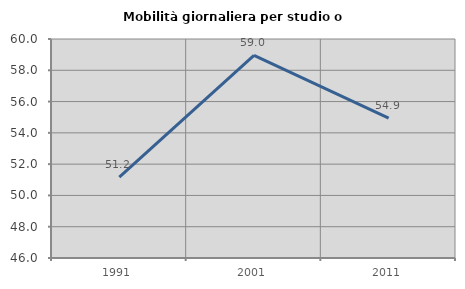
| Category | Mobilità giornaliera per studio o lavoro |
|---|---|
| 1991.0 | 51.171 |
| 2001.0 | 58.955 |
| 2011.0 | 54.937 |